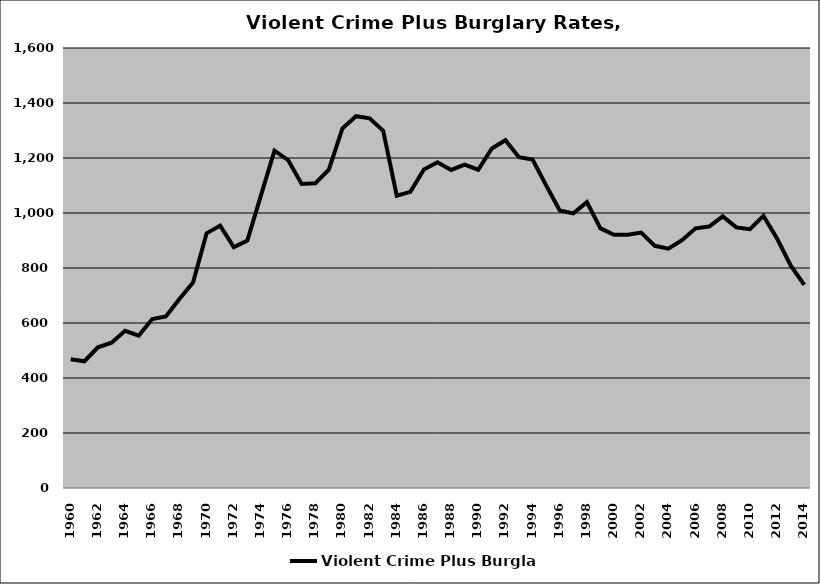
| Category | Violent Crime Plus Burglary |
|---|---|
| 1960.0 | 468.409 |
| 1961.0 | 460.923 |
| 1962.0 | 511.746 |
| 1963.0 | 528.498 |
| 1964.0 | 571.605 |
| 1965.0 | 553.728 |
| 1966.0 | 614.232 |
| 1967.0 | 623.487 |
| 1968.0 | 687.179 |
| 1969.0 | 747.03 |
| 1970.0 | 926.254 |
| 1971.0 | 954.083 |
| 1972.0 | 875.871 |
| 1973.0 | 899.82 |
| 1974.0 | 1064.105 |
| 1975.0 | 1226.826 |
| 1976.0 | 1192.328 |
| 1977.0 | 1105.813 |
| 1978.0 | 1107.747 |
| 1979.0 | 1157.641 |
| 1980.0 | 1307.491 |
| 1981.0 | 1351.871 |
| 1982.0 | 1344.041 |
| 1983.0 | 1299.219 |
| 1984.0 | 1063.014 |
| 1985.0 | 1076.838 |
| 1986.0 | 1158.584 |
| 1987.0 | 1184.867 |
| 1988.0 | 1156.436 |
| 1989.0 | 1175.959 |
| 1990.0 | 1157.302 |
| 1991.0 | 1234.527 |
| 1992.0 | 1264.581 |
| 1993.0 | 1202.718 |
| 1994.0 | 1194.382 |
| 1995.0 | 1100.207 |
| 1996.0 | 1008.857 |
| 1997.0 | 998.567 |
| 1998.0 | 1039.304 |
| 1999.0 | 944.046 |
| 2000.0 | 920.661 |
| 2001.0 | 921.005 |
| 2002.0 | 928.94 |
| 2003.0 | 880.63 |
| 2004.0 | 870.484 |
| 2005.0 | 900.923 |
| 2006.0 | 944.158 |
| 2007.0 | 950.519 |
| 2008.0 | 987.656 |
| 2009.0 | 947.588 |
| 2010.0 | 941.128 |
| 2011.0 | 989.623 |
| 2012.0 | 907.111 |
| 2013.0 | 809.418 |
| 2014.0 | 738.287 |